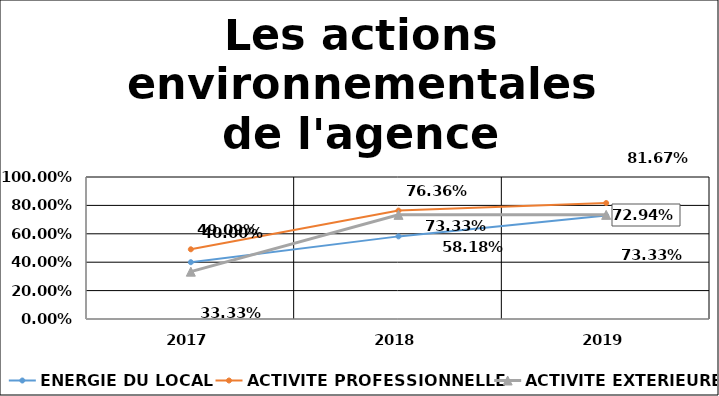
| Category | ENERGIE DU LOCAL | ACTIVITE PROFESSIONNELLE | ACTIVITE EXTERIEURE |
|---|---|---|---|
| 2017.0 | 0.4 | 0.491 | 0.333 |
| 2018.0 | 0.582 | 0.764 | 0.733 |
| 2019.0 | 0.729 | 0.817 | 0.733 |